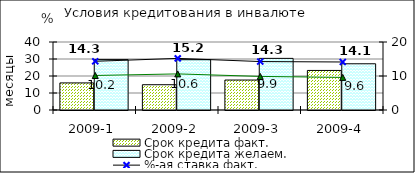
| Category | Срок кредита факт.  | Срок кредита желаем. |
|---|---|---|
| 2009-1 | 15.93 | 29.65 |
| 2009-2 | 14.87 | 29.6 |
| 2009-3 | 17.62 | 30.36 |
| 2009-4 | 23.27 | 27.19 |